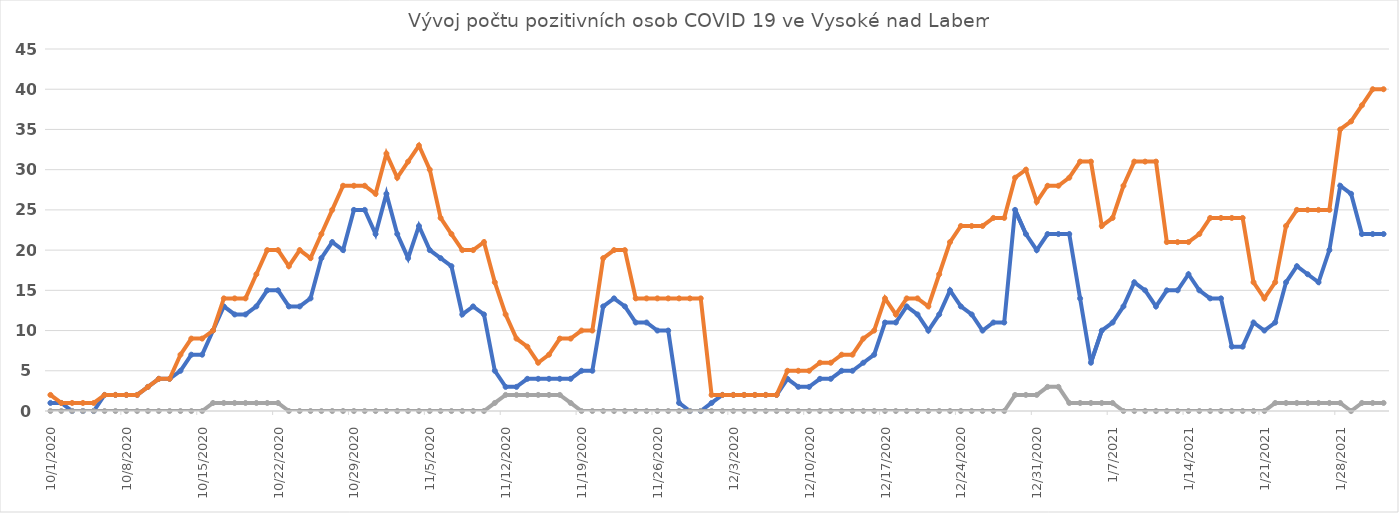
| Category | Series 0 | Series 1 | Series 2 |
|---|---|---|---|
| 10/1/20 | 1 | 2 | 0 |
| 10/2/20 | 1 | 1 | 0 |
| 10/3/20 | 0 | 1 | 0 |
| 10/4/20 | 0 | 1 | 0 |
| 10/5/20 | 0 | 1 | 0 |
| 10/6/20 | 2 | 2 | 0 |
| 10/7/20 | 2 | 2 | 0 |
| 10/8/20 | 2 | 2 | 0 |
| 10/9/20 | 2 | 2 | 0 |
| 10/10/20 | 3 | 3 | 0 |
| 10/11/20 | 4 | 4 | 0 |
| 10/12/20 | 4 | 4 | 0 |
| 10/13/20 | 5 | 7 | 0 |
| 10/14/20 | 7 | 9 | 0 |
| 10/15/20 | 7 | 9 | 0 |
| 10/16/20 | 10 | 10 | 1 |
| 10/17/20 | 13 | 14 | 1 |
| 10/18/20 | 12 | 14 | 1 |
| 10/19/20 | 12 | 14 | 1 |
| 10/20/20 | 13 | 17 | 1 |
| 10/21/20 | 15 | 20 | 1 |
| 10/22/20 | 15 | 20 | 1 |
| 10/23/20 | 13 | 18 | 0 |
| 10/24/20 | 13 | 20 | 0 |
| 10/25/20 | 14 | 19 | 0 |
| 10/26/20 | 19 | 22 | 0 |
| 10/27/20 | 21 | 25 | 0 |
| 10/28/20 | 20 | 28 | 0 |
| 10/29/20 | 25 | 28 | 0 |
| 10/30/20 | 25 | 28 | 0 |
| 10/31/20 | 22 | 27 | 0 |
| 11/1/20 | 27 | 32 | 0 |
| 11/2/20 | 22 | 29 | 0 |
| 11/3/20 | 19 | 31 | 0 |
| 11/4/20 | 23 | 33 | 0 |
| 11/5/20 | 20 | 30 | 0 |
| 11/6/20 | 19 | 24 | 0 |
| 11/7/20 | 18 | 22 | 0 |
| 11/8/20 | 12 | 20 | 0 |
| 11/9/20 | 13 | 20 | 0 |
| 11/10/20 | 12 | 21 | 0 |
| 11/11/20 | 5 | 16 | 1 |
| 11/12/20 | 3 | 12 | 2 |
| 11/13/20 | 3 | 9 | 2 |
| 11/14/20 | 4 | 8 | 2 |
| 11/15/20 | 4 | 6 | 2 |
| 11/16/20 | 4 | 7 | 2 |
| 11/17/20 | 4 | 9 | 2 |
| 11/18/20 | 4 | 9 | 1 |
| 11/19/20 | 5 | 10 | 0 |
| 11/20/20 | 5 | 10 | 0 |
| 11/21/20 | 13 | 19 | 0 |
| 11/22/20 | 14 | 20 | 0 |
| 11/23/20 | 13 | 20 | 0 |
| 11/24/20 | 11 | 14 | 0 |
| 11/25/20 | 11 | 14 | 0 |
| 11/26/20 | 10 | 14 | 0 |
| 11/27/20 | 10 | 14 | 0 |
| 11/28/20 | 1 | 14 | 0 |
| 11/29/20 | 0 | 14 | 0 |
| 11/30/20 | 0 | 14 | 0 |
| 12/1/20 | 1 | 2 | 0 |
| 12/2/20 | 2 | 2 | 0 |
| 12/3/20 | 2 | 2 | 0 |
| 12/4/20 | 2 | 2 | 0 |
| 12/5/20 | 2 | 2 | 0 |
| 12/6/20 | 2 | 2 | 0 |
| 12/7/20 | 2 | 2 | 0 |
| 12/8/20 | 4 | 5 | 0 |
| 12/9/20 | 3 | 5 | 0 |
| 12/10/20 | 3 | 5 | 0 |
| 12/11/20 | 4 | 6 | 0 |
| 12/12/20 | 4 | 6 | 0 |
| 12/13/20 | 5 | 7 | 0 |
| 12/14/20 | 5 | 7 | 0 |
| 12/15/20 | 6 | 9 | 0 |
| 12/16/20 | 7 | 10 | 0 |
| 12/17/20 | 11 | 14 | 0 |
| 12/18/20 | 11 | 12 | 0 |
| 12/19/20 | 13 | 14 | 0 |
| 12/20/20 | 12 | 14 | 0 |
| 12/21/20 | 10 | 13 | 0 |
| 12/22/20 | 12 | 17 | 0 |
| 12/23/20 | 15 | 21 | 0 |
| 12/24/20 | 13 | 23 | 0 |
| 12/25/20 | 12 | 23 | 0 |
| 12/26/20 | 10 | 23 | 0 |
| 12/27/20 | 11 | 24 | 0 |
| 12/28/20 | 11 | 24 | 0 |
| 12/29/20 | 25 | 29 | 2 |
| 12/30/20 | 22 | 30 | 2 |
| 12/31/20 | 20 | 26 | 2 |
| 1/1/21 | 22 | 28 | 3 |
| 1/2/21 | 22 | 28 | 3 |
| 1/3/21 | 22 | 29 | 1 |
| 1/4/21 | 14 | 31 | 1 |
| 1/5/21 | 6 | 31 | 1 |
| 1/6/21 | 10 | 23 | 1 |
| 1/7/21 | 11 | 24 | 1 |
| 1/8/21 | 13 | 28 | 0 |
| 1/9/21 | 16 | 31 | 0 |
| 1/10/21 | 15 | 31 | 0 |
| 1/11/21 | 13 | 31 | 0 |
| 1/12/21 | 15 | 21 | 0 |
| 1/13/21 | 15 | 21 | 0 |
| 1/14/21 | 17 | 21 | 0 |
| 1/15/21 | 15 | 22 | 0 |
| 1/16/21 | 14 | 24 | 0 |
| 1/17/21 | 14 | 24 | 0 |
| 1/18/21 | 8 | 24 | 0 |
| 1/19/21 | 8 | 24 | 0 |
| 1/20/21 | 11 | 16 | 0 |
| 1/21/21 | 10 | 14 | 0 |
| 1/22/21 | 11 | 16 | 1 |
| 1/23/21 | 16 | 23 | 1 |
| 1/24/21 | 18 | 25 | 1 |
| 1/25/21 | 17 | 25 | 1 |
| 1/26/21 | 16 | 25 | 1 |
| 1/27/21 | 20 | 25 | 1 |
| 1/28/21 | 28 | 35 | 1 |
| 1/29/21 | 27 | 36 | 0 |
| 1/30/21 | 22 | 38 | 1 |
| 1/31/21 | 22 | 40 | 1 |
| 2/1/21 | 22 | 40 | 1 |